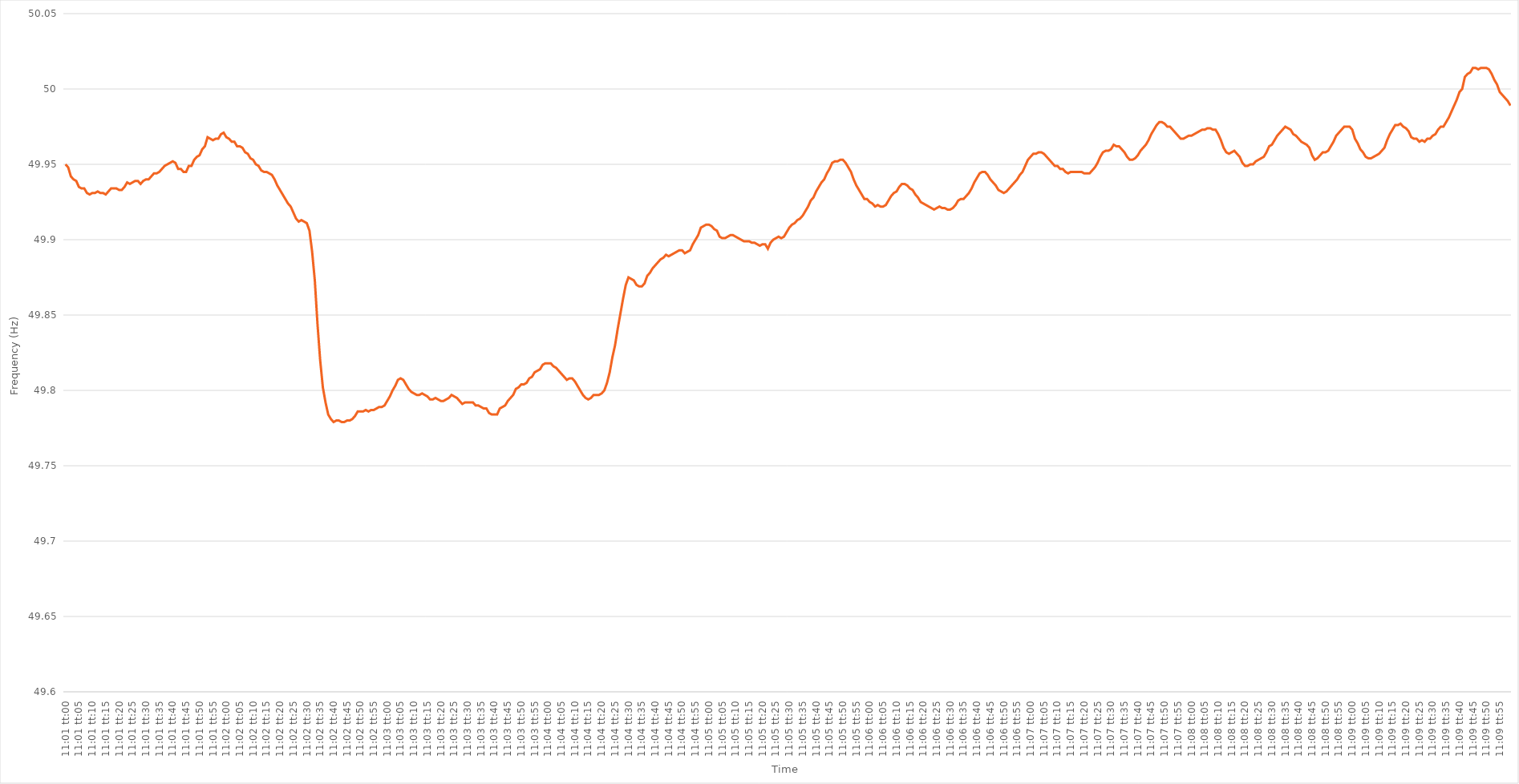
| Category | Series 0 |
|---|---|
| 0.4590277777777778 | 49.95 |
| 0.45903935185185185 | 49.948 |
| 0.4590509259259259 | 49.942 |
| 0.4590625 | 49.94 |
| 0.459074074074074 | 49.939 |
| 0.4590856481481482 | 49.935 |
| 0.4590972222222222 | 49.934 |
| 0.4591087962962963 | 49.934 |
| 0.45912037037037035 | 49.931 |
| 0.45913194444444444 | 49.93 |
| 0.4591435185185185 | 49.931 |
| 0.45915509259259263 | 49.931 |
| 0.45916666666666667 | 49.932 |
| 0.45917824074074076 | 49.931 |
| 0.4591898148148148 | 49.931 |
| 0.4592013888888889 | 49.93 |
| 0.45921296296296293 | 49.932 |
| 0.4592245370370371 | 49.934 |
| 0.4592361111111111 | 49.934 |
| 0.4592476851851852 | 49.934 |
| 0.45925925925925926 | 49.933 |
| 0.45927083333333335 | 49.933 |
| 0.4592824074074074 | 49.935 |
| 0.45929398148148143 | 49.938 |
| 0.4593055555555556 | 49.937 |
| 0.4593171296296296 | 49.938 |
| 0.4593287037037037 | 49.939 |
| 0.45934027777777775 | 49.939 |
| 0.45935185185185184 | 49.937 |
| 0.4593634259259259 | 49.939 |
| 0.45937500000000003 | 49.94 |
| 0.45938657407407407 | 49.94 |
| 0.45939814814814817 | 49.942 |
| 0.4594097222222222 | 49.944 |
| 0.4594212962962963 | 49.944 |
| 0.45943287037037034 | 49.945 |
| 0.4594444444444445 | 49.947 |
| 0.4594560185185185 | 49.949 |
| 0.4594675925925926 | 49.95 |
| 0.45947916666666666 | 49.951 |
| 0.45949074074074076 | 49.952 |
| 0.4595023148148148 | 49.951 |
| 0.45951388888888894 | 49.947 |
| 0.459525462962963 | 49.947 |
| 0.459537037037037 | 49.945 |
| 0.4595486111111111 | 49.945 |
| 0.45956018518518515 | 49.949 |
| 0.45957175925925925 | 49.949 |
| 0.4595833333333333 | 49.953 |
| 0.45959490740740744 | 49.955 |
| 0.4596064814814815 | 49.956 |
| 0.45961805555555557 | 49.96 |
| 0.4596296296296296 | 49.962 |
| 0.4596412037037037 | 49.968 |
| 0.45965277777777774 | 49.967 |
| 0.4596643518518519 | 49.966 |
| 0.45967592592592593 | 49.967 |
| 0.4596875 | 49.967 |
| 0.45969907407407407 | 49.97 |
| 0.45971064814814816 | 49.971 |
| 0.4597222222222222 | 49.968 |
| 0.45973379629629635 | 49.967 |
| 0.4597453703703704 | 49.965 |
| 0.4597569444444444 | 49.965 |
| 0.4597685185185185 | 49.962 |
| 0.45978009259259256 | 49.962 |
| 0.45979166666666665 | 49.961 |
| 0.4598032407407407 | 49.958 |
| 0.45981481481481484 | 49.957 |
| 0.4598263888888889 | 49.954 |
| 0.459837962962963 | 49.953 |
| 0.459849537037037 | 49.95 |
| 0.4598611111111111 | 49.949 |
| 0.45987268518518515 | 49.946 |
| 0.4598842592592593 | 49.945 |
| 0.45989583333333334 | 49.945 |
| 0.45990740740740743 | 49.944 |
| 0.45991898148148147 | 49.943 |
| 0.45993055555555556 | 49.94 |
| 0.4599421296296296 | 49.936 |
| 0.45995370370370375 | 49.933 |
| 0.4599652777777778 | 49.93 |
| 0.4599768518518519 | 49.927 |
| 0.4599884259259259 | 49.924 |
| 0.45999999999999996 | 49.922 |
| 0.46001157407407406 | 49.918 |
| 0.4600231481481481 | 49.914 |
| 0.46003472222222225 | 49.912 |
| 0.4600462962962963 | 49.913 |
| 0.4600578703703704 | 49.912 |
| 0.4600694444444444 | 49.911 |
| 0.4600810185185185 | 49.906 |
| 0.46009259259259255 | 49.892 |
| 0.4601041666666667 | 49.873 |
| 0.46011574074074074 | 49.844 |
| 0.46012731481481484 | 49.82 |
| 0.4601388888888889 | 49.802 |
| 0.46015046296296297 | 49.792 |
| 0.460162037037037 | 49.784 |
| 0.46017361111111116 | 49.781 |
| 0.4601851851851852 | 49.779 |
| 0.4601967592592593 | 49.78 |
| 0.46020833333333333 | 49.78 |
| 0.4602199074074074 | 49.779 |
| 0.46023148148148146 | 49.779 |
| 0.4602430555555555 | 49.78 |
| 0.46025462962962965 | 49.78 |
| 0.4602662037037037 | 49.781 |
| 0.4602777777777778 | 49.783 |
| 0.4602893518518518 | 49.786 |
| 0.4603009259259259 | 49.786 |
| 0.46031249999999996 | 49.786 |
| 0.4603240740740741 | 49.787 |
| 0.46033564814814815 | 49.786 |
| 0.46034722222222224 | 49.787 |
| 0.4603587962962963 | 49.787 |
| 0.4603703703703704 | 49.788 |
| 0.4603819444444444 | 49.789 |
| 0.46039351851851856 | 49.789 |
| 0.4604050925925926 | 49.79 |
| 0.4604166666666667 | 49.793 |
| 0.46042824074074074 | 49.796 |
| 0.46043981481481483 | 49.8 |
| 0.46045138888888887 | 49.803 |
| 0.460462962962963 | 49.807 |
| 0.46047453703703706 | 49.808 |
| 0.4604861111111111 | 49.807 |
| 0.4604976851851852 | 49.804 |
| 0.46050925925925923 | 49.801 |
| 0.4605208333333333 | 49.799 |
| 0.46053240740740736 | 49.798 |
| 0.4605439814814815 | 49.797 |
| 0.46055555555555555 | 49.797 |
| 0.46056712962962965 | 49.798 |
| 0.4605787037037037 | 49.797 |
| 0.4605902777777778 | 49.796 |
| 0.4606018518518518 | 49.794 |
| 0.46061342592592597 | 49.794 |
| 0.460625 | 49.795 |
| 0.4606365740740741 | 49.794 |
| 0.46064814814814814 | 49.793 |
| 0.46065972222222223 | 49.793 |
| 0.4606712962962963 | 49.794 |
| 0.4606828703703704 | 49.795 |
| 0.46069444444444446 | 49.797 |
| 0.4607060185185185 | 49.796 |
| 0.4607175925925926 | 49.795 |
| 0.46072916666666663 | 49.793 |
| 0.46074074074074073 | 49.791 |
| 0.46075231481481477 | 49.792 |
| 0.4607638888888889 | 49.792 |
| 0.46077546296296296 | 49.792 |
| 0.46078703703703705 | 49.792 |
| 0.4607986111111111 | 49.79 |
| 0.4608101851851852 | 49.79 |
| 0.4608217592592592 | 49.789 |
| 0.4608333333333334 | 49.788 |
| 0.4608449074074074 | 49.788 |
| 0.4608564814814815 | 49.785 |
| 0.46086805555555554 | 49.784 |
| 0.46087962962962964 | 49.784 |
| 0.4608912037037037 | 49.784 |
| 0.46090277777777783 | 49.788 |
| 0.46091435185185187 | 49.789 |
| 0.46092592592592596 | 49.79 |
| 0.4609375 | 49.793 |
| 0.46094907407407404 | 49.795 |
| 0.46096064814814813 | 49.797 |
| 0.46097222222222217 | 49.801 |
| 0.4609837962962963 | 49.802 |
| 0.46099537037037036 | 49.804 |
| 0.46100694444444446 | 49.804 |
| 0.4610185185185185 | 49.805 |
| 0.4610300925925926 | 49.808 |
| 0.4610416666666666 | 49.809 |
| 0.4610532407407408 | 49.812 |
| 0.4610648148148148 | 49.813 |
| 0.4610763888888889 | 49.814 |
| 0.46108796296296295 | 49.817 |
| 0.46109953703703704 | 49.818 |
| 0.4611111111111111 | 49.818 |
| 0.46112268518518523 | 49.818 |
| 0.46113425925925927 | 49.816 |
| 0.46114583333333337 | 49.815 |
| 0.4611574074074074 | 49.813 |
| 0.4611689814814815 | 49.811 |
| 0.46118055555555554 | 49.809 |
| 0.4611921296296296 | 49.807 |
| 0.4612037037037037 | 49.808 |
| 0.46121527777777777 | 49.808 |
| 0.46122685185185186 | 49.806 |
| 0.4612384259259259 | 49.803 |
| 0.46125 | 49.8 |
| 0.46126157407407403 | 49.797 |
| 0.4612731481481482 | 49.795 |
| 0.4612847222222222 | 49.794 |
| 0.4612962962962963 | 49.795 |
| 0.46130787037037035 | 49.797 |
| 0.46131944444444445 | 49.797 |
| 0.4613310185185185 | 49.797 |
| 0.46134259259259264 | 49.798 |
| 0.4613541666666667 | 49.8 |
| 0.46136574074074077 | 49.805 |
| 0.4613773148148148 | 49.812 |
| 0.4613888888888889 | 49.822 |
| 0.46140046296296294 | 49.83 |
| 0.461412037037037 | 49.841 |
| 0.46142361111111113 | 49.851 |
| 0.46143518518518517 | 49.861 |
| 0.46144675925925926 | 49.87 |
| 0.4614583333333333 | 49.875 |
| 0.4614699074074074 | 49.874 |
| 0.46148148148148144 | 49.873 |
| 0.4614930555555556 | 49.87 |
| 0.4615046296296296 | 49.869 |
| 0.4615162037037037 | 49.869 |
| 0.46152777777777776 | 49.871 |
| 0.46153935185185185 | 49.876 |
| 0.4615509259259259 | 49.878 |
| 0.46156250000000004 | 49.881 |
| 0.4615740740740741 | 49.883 |
| 0.4615856481481482 | 49.885 |
| 0.4615972222222222 | 49.887 |
| 0.4616087962962963 | 49.888 |
| 0.46162037037037035 | 49.89 |
| 0.4616319444444445 | 49.889 |
| 0.46164351851851854 | 49.89 |
| 0.4616550925925926 | 49.891 |
| 0.46166666666666667 | 49.892 |
| 0.4616782407407407 | 49.893 |
| 0.4616898148148148 | 49.893 |
| 0.46170138888888884 | 49.891 |
| 0.461712962962963 | 49.892 |
| 0.46172453703703703 | 49.893 |
| 0.4617361111111111 | 49.897 |
| 0.46174768518518516 | 49.9 |
| 0.46175925925925926 | 49.903 |
| 0.4617708333333333 | 49.908 |
| 0.46178240740740745 | 49.909 |
| 0.4617939814814815 | 49.91 |
| 0.4618055555555556 | 49.91 |
| 0.4618171296296296 | 49.909 |
| 0.4618287037037037 | 49.907 |
| 0.46184027777777775 | 49.906 |
| 0.4618518518518519 | 49.902 |
| 0.46186342592592594 | 49.901 |
| 0.46187500000000004 | 49.901 |
| 0.4618865740740741 | 49.902 |
| 0.4618981481481481 | 49.903 |
| 0.4619097222222222 | 49.903 |
| 0.46192129629629625 | 49.902 |
| 0.4619328703703704 | 49.901 |
| 0.46194444444444444 | 49.9 |
| 0.46195601851851853 | 49.899 |
| 0.46196759259259257 | 49.899 |
| 0.46197916666666666 | 49.899 |
| 0.4619907407407407 | 49.898 |
| 0.46200231481481485 | 49.898 |
| 0.4620138888888889 | 49.897 |
| 0.462025462962963 | 49.896 |
| 0.462037037037037 | 49.897 |
| 0.4620486111111111 | 49.897 |
| 0.46206018518518516 | 49.894 |
| 0.4620717592592593 | 49.898 |
| 0.46208333333333335 | 49.9 |
| 0.46209490740740744 | 49.901 |
| 0.4621064814814815 | 49.902 |
| 0.4621180555555556 | 49.901 |
| 0.4621296296296296 | 49.902 |
| 0.46214120370370365 | 49.905 |
| 0.4621527777777778 | 49.908 |
| 0.46216435185185184 | 49.91 |
| 0.46217592592592593 | 49.911 |
| 0.4621875 | 49.913 |
| 0.46219907407407407 | 49.914 |
| 0.4622106481481481 | 49.916 |
| 0.46222222222222226 | 49.919 |
| 0.4622337962962963 | 49.922 |
| 0.4622453703703704 | 49.926 |
| 0.46225694444444443 | 49.928 |
| 0.4622685185185185 | 49.932 |
| 0.46228009259259256 | 49.935 |
| 0.4622916666666667 | 49.938 |
| 0.46230324074074075 | 49.94 |
| 0.46231481481481485 | 49.944 |
| 0.4623263888888889 | 49.947 |
| 0.462337962962963 | 49.951 |
| 0.462349537037037 | 49.952 |
| 0.46236111111111106 | 49.952 |
| 0.4623726851851852 | 49.953 |
| 0.46238425925925924 | 49.953 |
| 0.46239583333333334 | 49.951 |
| 0.4624074074074074 | 49.948 |
| 0.4624189814814815 | 49.945 |
| 0.4624305555555555 | 49.94 |
| 0.46244212962962966 | 49.936 |
| 0.4624537037037037 | 49.933 |
| 0.4624652777777778 | 49.93 |
| 0.46247685185185183 | 49.927 |
| 0.46248842592592593 | 49.927 |
| 0.46249999999999997 | 49.925 |
| 0.4625115740740741 | 49.924 |
| 0.46252314814814816 | 49.922 |
| 0.46253472222222225 | 49.923 |
| 0.4625462962962963 | 49.922 |
| 0.4625578703703704 | 49.922 |
| 0.4625694444444444 | 49.923 |
| 0.46258101851851857 | 49.926 |
| 0.4625925925925926 | 49.929 |
| 0.46260416666666665 | 49.931 |
| 0.46261574074074074 | 49.932 |
| 0.4626273148148148 | 49.935 |
| 0.4626388888888889 | 49.937 |
| 0.4626504629629629 | 49.937 |
| 0.46266203703703707 | 49.936 |
| 0.4626736111111111 | 49.934 |
| 0.4626851851851852 | 49.933 |
| 0.46269675925925924 | 49.93 |
| 0.46270833333333333 | 49.928 |
| 0.46271990740740737 | 49.925 |
| 0.4627314814814815 | 49.924 |
| 0.46274305555555556 | 49.923 |
| 0.46275462962962965 | 49.922 |
| 0.4627662037037037 | 49.921 |
| 0.4627777777777778 | 49.92 |
| 0.4627893518518518 | 49.921 |
| 0.462800925925926 | 49.922 |
| 0.4628125 | 49.921 |
| 0.4628240740740741 | 49.921 |
| 0.46283564814814815 | 49.92 |
| 0.4628472222222222 | 49.92 |
| 0.4628587962962963 | 49.921 |
| 0.4628703703703703 | 49.923 |
| 0.46288194444444447 | 49.926 |
| 0.4628935185185185 | 49.927 |
| 0.4629050925925926 | 49.927 |
| 0.46291666666666664 | 49.929 |
| 0.46292824074074074 | 49.931 |
| 0.4629398148148148 | 49.934 |
| 0.4629513888888889 | 49.938 |
| 0.46296296296296297 | 49.941 |
| 0.46297453703703706 | 49.944 |
| 0.4629861111111111 | 49.945 |
| 0.4629976851851852 | 49.945 |
| 0.46300925925925923 | 49.943 |
| 0.4630208333333334 | 49.94 |
| 0.4630324074074074 | 49.938 |
| 0.4630439814814815 | 49.936 |
| 0.46305555555555555 | 49.933 |
| 0.46306712962962965 | 49.932 |
| 0.4630787037037037 | 49.931 |
| 0.4630902777777777 | 49.932 |
| 0.4631018518518519 | 49.934 |
| 0.4631134259259259 | 49.936 |
| 0.463125 | 49.938 |
| 0.46313657407407405 | 49.94 |
| 0.46314814814814814 | 49.943 |
| 0.4631597222222222 | 49.945 |
| 0.46317129629629633 | 49.949 |
| 0.46318287037037037 | 49.953 |
| 0.46319444444444446 | 49.955 |
| 0.4632060185185185 | 49.957 |
| 0.4632175925925926 | 49.957 |
| 0.46322916666666664 | 49.958 |
| 0.4632407407407408 | 49.958 |
| 0.4632523148148148 | 49.957 |
| 0.4632638888888889 | 49.955 |
| 0.46327546296296296 | 49.953 |
| 0.46328703703703705 | 49.951 |
| 0.4632986111111111 | 49.949 |
| 0.46331018518518513 | 49.949 |
| 0.4633217592592593 | 49.947 |
| 0.4633333333333333 | 49.947 |
| 0.4633449074074074 | 49.945 |
| 0.46335648148148145 | 49.944 |
| 0.46336805555555555 | 49.945 |
| 0.4633796296296296 | 49.945 |
| 0.46339120370370374 | 49.945 |
| 0.4634027777777778 | 49.945 |
| 0.46341435185185187 | 49.945 |
| 0.4634259259259259 | 49.944 |
| 0.4634375 | 49.944 |
| 0.46344907407407404 | 49.944 |
| 0.4634606481481482 | 49.946 |
| 0.46347222222222223 | 49.948 |
| 0.4634837962962963 | 49.951 |
| 0.46349537037037036 | 49.955 |
| 0.46350694444444446 | 49.958 |
| 0.4635185185185185 | 49.959 |
| 0.46353009259259265 | 49.959 |
| 0.4635416666666667 | 49.96 |
| 0.4635532407407407 | 49.963 |
| 0.4635648148148148 | 49.962 |
| 0.46357638888888886 | 49.962 |
| 0.46358796296296295 | 49.96 |
| 0.463599537037037 | 49.958 |
| 0.46361111111111114 | 49.955 |
| 0.4636226851851852 | 49.953 |
| 0.4636342592592593 | 49.953 |
| 0.4636458333333333 | 49.954 |
| 0.4636574074074074 | 49.956 |
| 0.46366898148148145 | 49.959 |
| 0.4636805555555556 | 49.961 |
| 0.46369212962962963 | 49.963 |
| 0.46370370370370373 | 49.966 |
| 0.46371527777777777 | 49.97 |
| 0.46372685185185186 | 49.973 |
| 0.4637384259259259 | 49.976 |
| 0.46375000000000005 | 49.978 |
| 0.4637615740740741 | 49.978 |
| 0.4637731481481482 | 49.977 |
| 0.4637847222222222 | 49.975 |
| 0.46379629629629626 | 49.975 |
| 0.46380787037037036 | 49.973 |
| 0.4638194444444444 | 49.971 |
| 0.46383101851851855 | 49.969 |
| 0.4638425925925926 | 49.967 |
| 0.4638541666666667 | 49.967 |
| 0.4638657407407407 | 49.968 |
| 0.4638773148148148 | 49.969 |
| 0.46388888888888885 | 49.969 |
| 0.463900462962963 | 49.97 |
| 0.46391203703703704 | 49.971 |
| 0.46392361111111113 | 49.972 |
| 0.4639351851851852 | 49.973 |
| 0.46394675925925927 | 49.973 |
| 0.4639583333333333 | 49.974 |
| 0.46396990740740746 | 49.974 |
| 0.4639814814814815 | 49.973 |
| 0.4639930555555556 | 49.973 |
| 0.46400462962962963 | 49.97 |
| 0.46401620370370367 | 49.966 |
| 0.46402777777777776 | 49.961 |
| 0.4640393518518518 | 49.958 |
| 0.46405092592592595 | 49.957 |
| 0.4640625 | 49.958 |
| 0.4640740740740741 | 49.959 |
| 0.4640856481481481 | 49.957 |
| 0.4640972222222222 | 49.955 |
| 0.46410879629629626 | 49.951 |
| 0.4641203703703704 | 49.949 |
| 0.46413194444444444 | 49.949 |
| 0.46414351851851854 | 49.95 |
| 0.4641550925925926 | 49.95 |
| 0.46416666666666667 | 49.952 |
| 0.4641782407407407 | 49.953 |
| 0.46418981481481486 | 49.954 |
| 0.4642013888888889 | 49.955 |
| 0.464212962962963 | 49.958 |
| 0.46422453703703703 | 49.962 |
| 0.4642361111111111 | 49.963 |
| 0.46424768518518517 | 49.966 |
| 0.4642592592592592 | 49.969 |
| 0.46427083333333335 | 49.971 |
| 0.4642824074074074 | 49.973 |
| 0.4642939814814815 | 49.975 |
| 0.4643055555555555 | 49.974 |
| 0.4643171296296296 | 49.973 |
| 0.46432870370370366 | 49.97 |
| 0.4643402777777778 | 49.969 |
| 0.46435185185185185 | 49.967 |
| 0.46436342592592594 | 49.965 |
| 0.464375 | 49.964 |
| 0.4643865740740741 | 49.963 |
| 0.4643981481481481 | 49.961 |
| 0.46440972222222227 | 49.956 |
| 0.4644212962962963 | 49.953 |
| 0.4644328703703704 | 49.954 |
| 0.46444444444444444 | 49.956 |
| 0.46445601851851853 | 49.958 |
| 0.46446759259259257 | 49.958 |
| 0.4644791666666667 | 49.959 |
| 0.46449074074074076 | 49.962 |
| 0.4645023148148148 | 49.965 |
| 0.4645138888888889 | 49.969 |
| 0.46452546296296293 | 49.971 |
| 0.464537037037037 | 49.973 |
| 0.46454861111111106 | 49.975 |
| 0.4645601851851852 | 49.975 |
| 0.46457175925925925 | 49.975 |
| 0.46458333333333335 | 49.973 |
| 0.4645949074074074 | 49.967 |
| 0.4646064814814815 | 49.964 |
| 0.4646180555555555 | 49.96 |
| 0.46462962962962967 | 49.958 |
| 0.4646412037037037 | 49.955 |
| 0.4646527777777778 | 49.954 |
| 0.46466435185185184 | 49.954 |
| 0.46467592592592594 | 49.955 |
| 0.4646875 | 49.956 |
| 0.4646990740740741 | 49.957 |
| 0.46471064814814816 | 49.959 |
| 0.4647222222222222 | 49.961 |
| 0.4647337962962963 | 49.966 |
| 0.46474537037037034 | 49.97 |
| 0.46475694444444443 | 49.973 |
| 0.46476851851851847 | 49.976 |
| 0.4647800925925926 | 49.976 |
| 0.46479166666666666 | 49.977 |
| 0.46480324074074075 | 49.975 |
| 0.4648148148148148 | 49.974 |
| 0.4648263888888889 | 49.972 |
| 0.4648379629629629 | 49.968 |
| 0.4648495370370371 | 49.967 |
| 0.4648611111111111 | 49.967 |
| 0.4648726851851852 | 49.965 |
| 0.46488425925925925 | 49.966 |
| 0.46489583333333334 | 49.965 |
| 0.4649074074074074 | 49.967 |
| 0.46491898148148153 | 49.967 |
| 0.46493055555555557 | 49.969 |
| 0.46494212962962966 | 49.97 |
| 0.4649537037037037 | 49.973 |
| 0.4649652777777778 | 49.975 |
| 0.46497685185185184 | 49.975 |
| 0.4649884259259259 | 49.978 |
| 0.465 | 49.981 |
| 0.46501157407407406 | 49.985 |
| 0.46502314814814816 | 49.989 |
| 0.4650347222222222 | 49.993 |
| 0.4650462962962963 | 49.998 |
| 0.46505787037037033 | 50 |
| 0.4650694444444445 | 50.008 |
| 0.4650810185185185 | 50.01 |
| 0.4650925925925926 | 50.011 |
| 0.46510416666666665 | 50.014 |
| 0.46511574074074075 | 50.014 |
| 0.4651273148148148 | 50.013 |
| 0.46513888888888894 | 50.014 |
| 0.465150462962963 | 50.014 |
| 0.46516203703703707 | 50.014 |
| 0.4651736111111111 | 50.013 |
| 0.4651851851851852 | 50.01 |
| 0.46519675925925924 | 50.006 |
| 0.4652083333333333 | 50.003 |
| 0.46521990740740743 | 49.998 |
| 0.46523148148148147 | 49.996 |
| 0.46524305555555556 | 49.994 |
| 0.4652546296296296 | 49.992 |
| 0.4652662037037037 | 49.989 |